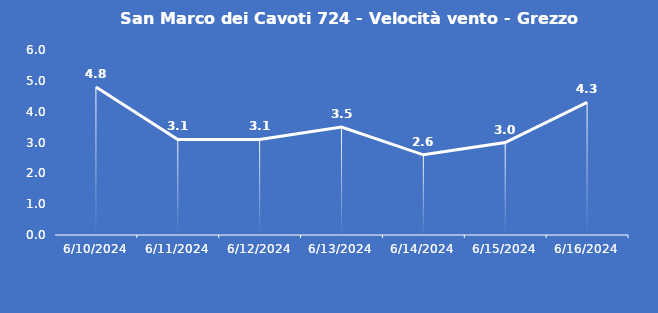
| Category | San Marco dei Cavoti 724 - Velocità vento - Grezzo (m/s) |
|---|---|
| 6/10/24 | 4.8 |
| 6/11/24 | 3.1 |
| 6/12/24 | 3.1 |
| 6/13/24 | 3.5 |
| 6/14/24 | 2.6 |
| 6/15/24 | 3 |
| 6/16/24 | 4.3 |